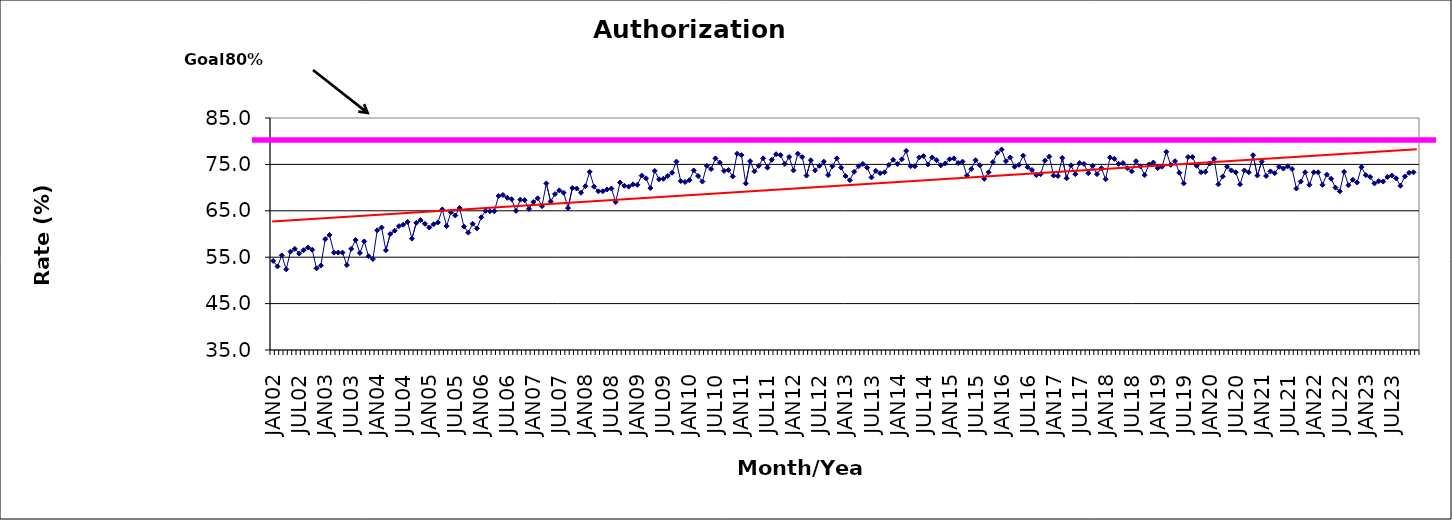
| Category | Series 0 |
|---|---|
| JAN02 | 54.2 |
| FEB02 | 53 |
| MAR02 | 55.4 |
| APR02 | 52.4 |
| MAY02 | 56.2 |
| JUN02 | 56.8 |
| JUL02 | 55.8 |
| AUG02 | 56.5 |
| SEP02 | 57.1 |
| OCT02 | 56.6 |
| NOV02 | 52.6 |
| DEC02 | 53.2 |
| JAN03 | 58.9 |
| FEB03 | 59.8 |
| MAR03 | 56 |
| APR03 | 56 |
| MAY03 | 56 |
| JUN03 | 53.3 |
| JUL03 | 56.8 |
| AUG03 | 58.7 |
| SEP03 | 55.9 |
| OCT03 | 58.4 |
| NOV03 | 55.2 |
| DEC03 | 54.6 |
| JAN04 | 60.8 |
| FEB04 | 61.4 |
| MAR04 | 56.5 |
| APR04 | 60 |
| MAY04 | 60.7 |
| JUN04 | 61.7 |
| JUL04 | 62 |
| AUG04 | 62.6 |
| SEP04 | 59 |
| OCT04 | 62.4 |
| NOV04 | 63 |
| DEC04 | 62.2 |
| JAN05 | 61.4 |
| FEB05 | 62.1 |
| MAR05 | 62.5 |
| APR05 | 65.3 |
| MAY05 | 61.7 |
| JUN05 | 64.7 |
| JUL05 | 64 |
| AUG05 | 65.6 |
| SEP05 | 61.6 |
| OCT05 | 60.3 |
| NOV05 | 62.2 |
| DEC05 | 61.2 |
| JAN06 | 63.6 |
| FEB06 | 65 |
| MAR06 | 64.9 |
| APR06 | 64.9 |
| MAY06 | 68.2 |
| JUN06 | 68.4 |
| JUL06 | 67.8 |
| AUG06 | 67.5 |
| SEP06 | 65 |
| OCT06 | 67.4 |
| NOV06 | 67.3 |
| DEC06 | 65.4 |
| JAN07 | 66.9 |
| FEB07 | 67.7 |
| MAR07 | 66 |
| APR07 | 70.9 |
| MAY07 | 67 |
| JUN07 | 68.6 |
| JUL07 | 69.4 |
| AUG07 | 68.9 |
| SEP07 | 65.6 |
| OCT07 | 69.9 |
| NOV07 | 69.8 |
| DEC07 | 68.9 |
| JAN08 | 70.3 |
| FEB08 | 73.4 |
| MAR08 | 70.2 |
| APR08 | 69.2 |
| MAY08 | 69.2 |
| JUN08 | 69.6 |
| JUL08 | 69.8 |
| AUG08 | 66.9 |
| SEP08 | 71.1 |
| OCT08 | 70.4 |
| NOV08 | 70.2 |
| DEC08 | 70.7 |
| JAN09 | 70.6 |
| FEB09 | 72.6 |
| MAR09 | 72 |
| APR09 | 69.9 |
| MAY09 | 73.6 |
| JUN09 | 71.8 |
| JUL09 | 71.9 |
| AUG09 | 72.5 |
| SEP09 | 73.2 |
| OCT09 | 75.6 |
| NOV09 | 71.4 |
| DEC09 | 71.2 |
| JAN10 | 71.6 |
| FEB10 | 73.7 |
| MAR10 | 72.5 |
| APR10 | 71.3 |
| MAY10 | 74.7 |
| JUN10 | 74 |
| JUL10 | 76.3 |
| AUG10 | 75.4 |
| SEP10 | 73.6 |
| OCT10 | 73.8 |
| NOV10 | 72.4 |
| DEC10 | 77.3 |
| JAN11 | 77 |
| FEB11 | 70.9 |
| MAR11 | 75.7 |
| APR11 | 73.5 |
| MAY11 | 74.7 |
| JUN11 | 76.3 |
| JUL11 | 74.3 |
| AUG11 | 76 |
| SEP11 | 77.2 |
| OCT11 | 77 |
| NOV11 | 75.1 |
| DEC11 | 76.6 |
| JAN12 | 73.7 |
| FEB12 | 77.3 |
| MAR12 | 76.6 |
| APR12 | 72.6 |
| MAY12 | 75.9 |
| JUN12 | 73.7 |
| JUL12 | 74.7 |
| AUG12 | 75.6 |
| SEP12 | 72.7 |
| OCT12 | 74.6 |
| NOV12 | 76.3 |
| DEC12 | 74.3 |
| JAN13 | 72.5 |
| FEB13 | 71.6 |
| MAR13 | 73.4 |
| APR13 | 74.6 |
| MAY13 | 75.1 |
| JUN13 | 74.3 |
| JUL13 | 72.2 |
| AUG13 | 73.6 |
| SEP13 | 73.1 |
| OCT13 | 73.3 |
| NOV13 | 74.9 |
| DEC13 | 76 |
| JAN14 | 75.1 |
| FEB14 | 76.1 |
| MAR14 | 77.9 |
| APR14 | 74.6 |
| MAY14 | 74.6 |
| JUN14 | 76.5 |
| JUL14 | 76.8 |
| AUG14 | 75 |
| SEP14 | 76.5 |
| OCT14 | 75.9 |
| NOV14 | 74.8 |
| DEC14 | 75.2 |
| JAN15 | 76.1 |
| FEB15 | 76.3 |
| MAR15 | 75.3 |
| APR15 | 75.6 |
| MAY15 | 72.6 |
| JUN15 | 74 |
| JUL15 | 75.9 |
| AUG15 | 74.8 |
| SEP15 | 71.9 |
| OCT15 | 73.3 |
| NOV15 | 75.5 |
| DEC15 | 77.5 |
| JAN16 | 78.2 |
| FEB16 | 75.7 |
| MAR16 | 76.5 |
| APR16 | 74.5 |
| MAY16 | 74.9 |
| JUN16 | 76.9 |
| JUL16 | 74.4 |
| AUG16 | 73.8 |
| SEP16 | 72.7 |
| OCT16 | 72.9 |
| NOV16 | 75.8 |
| DEC16 | 76.7 |
| JAN17 | 72.6 |
| FEB17 | 72.5 |
| MAR17 | 76.4 |
| APR17 | 72 |
| MAY17 | 74.8 |
| JUN17 | 72.9 |
| JUL17 | 75.3 |
| AUG17 | 75.1 |
| SEP17 | 73.1 |
| OCT17 | 74.7 |
| NOV17 | 72.9 |
| DEC17 | 74.2 |
| JAN18 | 71.8 |
| FEB18 | 76.5 |
| MAR18 | 76.2 |
| APR18 | 75.1 |
| MAY18 | 75.3 |
| JUN18 | 74.2 |
| JUL18 | 73.5 |
| AUG18 | 75.7 |
| SEP18 | 74.6 |
| OCT18 | 72.7 |
| NOV18 | 75 |
| DEC18 | 75.4 |
| JAN19 | 74.2 |
| FEB19 | 74.5 |
| MAR19 | 77.7 |
| APR19 | 74.9 |
| MAY19 | 75.7 |
| JUN19 | 73.2 |
| JUL19 | 70.9 |
| AUG19 | 76.6 |
| SEP19 | 76.6 |
| OCT19 | 74.7 |
| NOV19 | 73.3 |
| DEC19 | 73.4 |
| JAN20 | 75.2 |
| FEB20 | 76.2 |
| MAR20 | 70.7 |
| APR20 | 72.4 |
| MAY20 | 74.5 |
| JUN20 | 73.7 |
| JUL20 | 73.3 |
| AUG20 | 70.7 |
| SEP20 | 73.7 |
| OCT20 | 73.3 |
| NOV20 | 77 |
| DEC20 | 72.6 |
| JAN21 | 75.6 |
| FEB21 | 72.5 |
| MAR21 | 73.5 |
| APR21 | 73.1 |
| MAY21 | 74.5 |
| JUN21 | 74.1 |
| JUL21 | 74.6 |
| AUG21 | 74 |
| SEP21 | 69.8 |
| OCT21 | 71.3 |
| NOV21 | 73.3 |
| DEC21 | 70.6 |
| JAN22 | 73.3 |
| FEB22 | 73.3 |
| MAR22 | 70.6 |
| APR22 | 72.8 |
| MAY22 | 71.9 |
| JUN22 | 70 |
| JUL22 | 69.2 |
| AUG22 | 73.4 |
| SEP22 | 70.5 |
| OCT22 | 71.7 |
| NOV22 | 71.1 |
| DEC22 | 74.4 |
| JAN23 | 72.7 |
| FEB23 | 72.3 |
| MAR23 | 70.9 |
| APR23 | 71.4 |
| MAY23 | 71.3 |
| JUN23 | 72.3 |
| JUL23 | 72.6 |
| AUG23 | 72 |
| SEP23 | 70.4 |
| OCT23 | 72.4 |
| NOV23 | 73.2 |
| DEC23 | 73.3 |